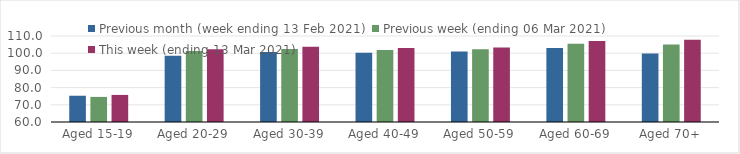
| Category | Previous month (week ending 13 Feb 2021) | Previous week (ending 06 Mar 2021) | This week (ending 13 Mar 2021) |
|---|---|---|---|
| Aged 15-19 | 75.27 | 74.59 | 75.74 |
| Aged 20-29 | 98.53 | 101.22 | 102.28 |
| Aged 30-39 | 100.64 | 102.51 | 103.68 |
| Aged 40-49 | 100.31 | 101.84 | 103.01 |
| Aged 50-59 | 100.93 | 102.29 | 103.27 |
| Aged 60-69 | 103.06 | 105.45 | 107.04 |
| Aged 70+ | 99.8 | 105.06 | 107.83 |